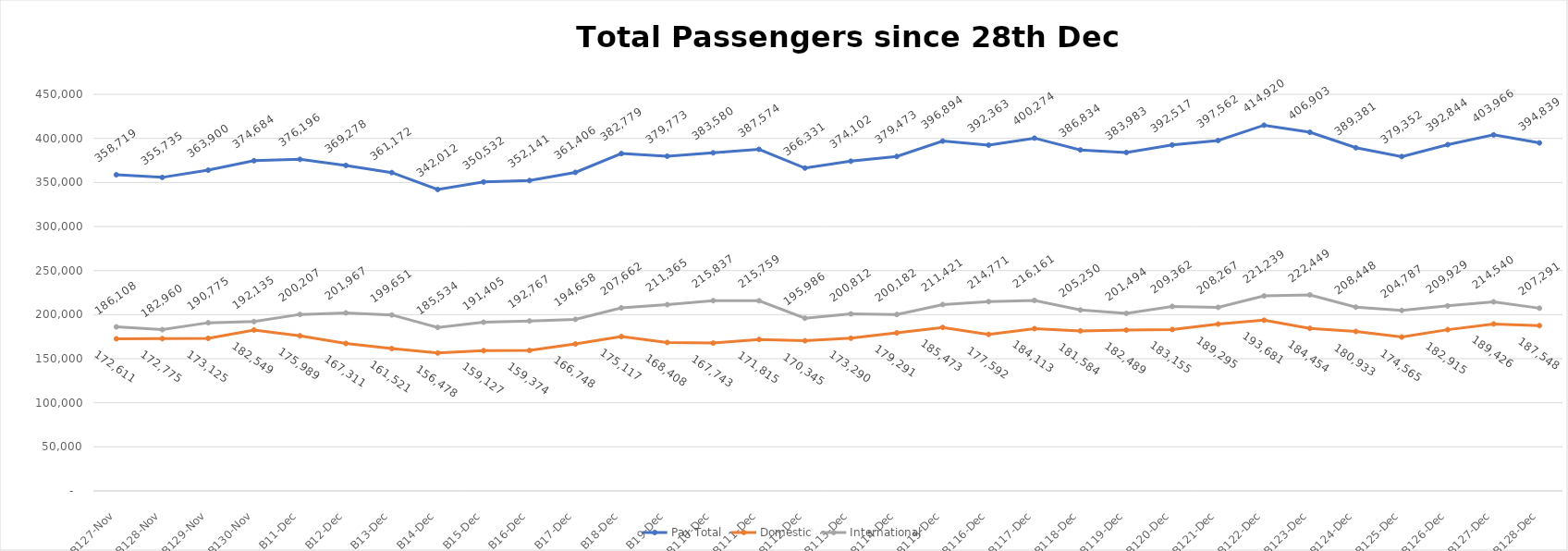
| Category | Pax Total |  Domestic  |  International  |
|---|---|---|---|
| 2023-11-27 | 358719 | 172611 | 186108 |
| 2023-11-28 | 355735 | 172775 | 182960 |
| 2023-11-29 | 363900 | 173125 | 190775 |
| 2023-11-30 | 374684 | 182549 | 192135 |
| 2023-12-01 | 376196 | 175989 | 200207 |
| 2023-12-02 | 369278 | 167311 | 201967 |
| 2023-12-03 | 361172 | 161521 | 199651 |
| 2023-12-04 | 342012 | 156478 | 185534 |
| 2023-12-05 | 350532 | 159127 | 191405 |
| 2023-12-06 | 352141 | 159374 | 192767 |
| 2023-12-07 | 361406 | 166748 | 194658 |
| 2023-12-08 | 382779 | 175117 | 207662 |
| 2023-12-09 | 379773 | 168408 | 211365 |
| 2023-12-10 | 383580 | 167743 | 215837 |
| 2023-12-11 | 387574 | 171815 | 215759 |
| 2023-12-12 | 366331 | 170345 | 195986 |
| 2023-12-13 | 374102 | 173290 | 200812 |
| 2023-12-14 | 379473 | 179291 | 200182 |
| 2023-12-15 | 396894 | 185473 | 211421 |
| 2023-12-16 | 392363 | 177592 | 214771 |
| 2023-12-17 | 400274 | 184113 | 216161 |
| 2023-12-18 | 386834 | 181584 | 205250 |
| 2023-12-19 | 383983 | 182489 | 201494 |
| 2023-12-20 | 392517 | 183155 | 209362 |
| 2023-12-21 | 397562 | 189295 | 208267 |
| 2023-12-22 | 414920 | 193681 | 221239 |
| 2023-12-23 | 406903 | 184454 | 222449 |
| 2023-12-24 | 389381 | 180933 | 208448 |
| 2023-12-25 | 379352 | 174565 | 204787 |
| 2023-12-26 | 392844 | 182915 | 209929 |
| 2023-12-27 | 403966 | 189426 | 214540 |
| 2023-12-28 | 394839 | 187548 | 207291 |